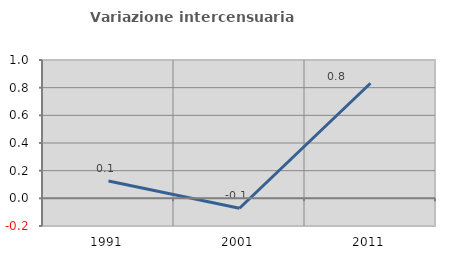
| Category | Variazione intercensuaria annua |
|---|---|
| 1991.0 | 0.125 |
| 2001.0 | -0.072 |
| 2011.0 | 0.832 |